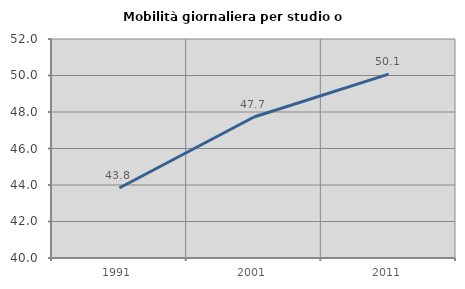
| Category | Mobilità giornaliera per studio o lavoro |
|---|---|
| 1991.0 | 43.838 |
| 2001.0 | 47.726 |
| 2011.0 | 50.074 |